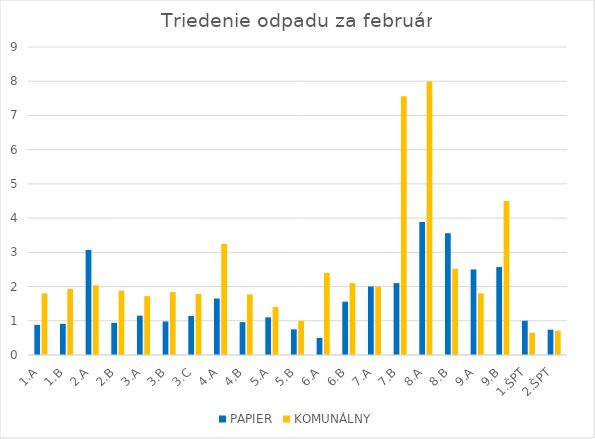
| Category | PAPIER | KOMUNÁLNY |
|---|---|---|
| 1.A | 0.88 | 1.8 |
| 1.B | 0.91 | 1.93 |
| 2.A | 3.071 | 2.03 |
| 2.B | 0.94 | 1.88 |
| 3.A | 1.15 | 1.72 |
| 3.B | 0.98 | 1.84 |
| 3.C | 1.14 | 1.78 |
| 4.A | 1.65 | 3.25 |
| 4.B | 0.96 | 1.77 |
| 5.A | 1.1 | 1.4 |
| 5.B | 0.75 | 1 |
| 6.A | 0.5 | 2.4 |
| 6.B | 1.56 | 2.1 |
| 7.A | 2 | 2 |
| 7.B | 2.1 | 7.56 |
| 8.A | 3.89 | 7.99 |
| 8.B | 3.56 | 2.52 |
| 9.A | 2.5 | 1.8 |
| 9.B | 2.57 | 4.5 |
| 1.ŠPT | 1 | 0.65 |
| 2.ŠPT | 0.74 | 0.71 |